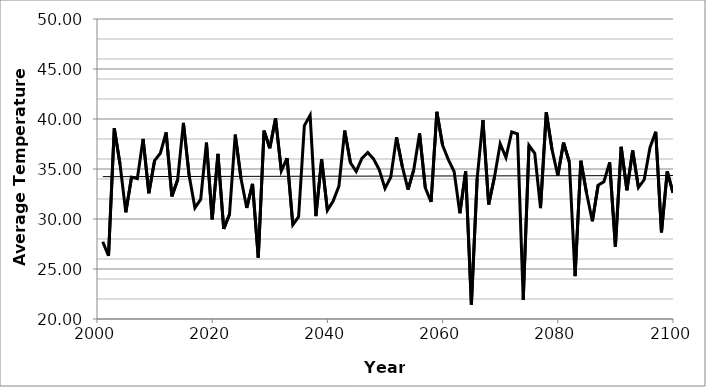
| Category | Committed |
|---|---|
| 2001.0 | 27.72 |
| 2002.0 | 26.314 |
| 2003.0 | 39.076 |
| 2004.0 | 35.478 |
| 2005.0 | 30.664 |
| 2006.0 | 34.189 |
| 2007.0 | 34.034 |
| 2008.0 | 38.005 |
| 2009.0 | 32.574 |
| 2010.0 | 35.845 |
| 2011.0 | 36.579 |
| 2012.0 | 38.653 |
| 2013.0 | 32.261 |
| 2014.0 | 33.915 |
| 2015.0 | 39.609 |
| 2016.0 | 34.345 |
| 2017.0 | 31.12 |
| 2018.0 | 31.96 |
| 2019.0 | 37.647 |
| 2020.0 | 29.964 |
| 2021.0 | 36.523 |
| 2022.0 | 29.012 |
| 2023.0 | 30.457 |
| 2024.0 | 38.437 |
| 2025.0 | 34.048 |
| 2026.0 | 31.107 |
| 2027.0 | 33.512 |
| 2028.0 | 26.134 |
| 2029.0 | 38.836 |
| 2030.0 | 37.076 |
| 2031.0 | 40.062 |
| 2032.0 | 34.806 |
| 2033.0 | 36.084 |
| 2034.0 | 29.417 |
| 2035.0 | 30.231 |
| 2036.0 | 39.337 |
| 2037.0 | 40.366 |
| 2038.0 | 30.281 |
| 2039.0 | 35.964 |
| 2040.0 | 30.873 |
| 2041.0 | 31.789 |
| 2042.0 | 33.294 |
| 2043.0 | 38.845 |
| 2044.0 | 35.631 |
| 2045.0 | 34.758 |
| 2046.0 | 36.081 |
| 2047.0 | 36.651 |
| 2048.0 | 36.021 |
| 2049.0 | 34.929 |
| 2050.0 | 33.062 |
| 2051.0 | 34.185 |
| 2052.0 | 38.167 |
| 2053.0 | 35.26 |
| 2054.0 | 32.938 |
| 2055.0 | 34.945 |
| 2056.0 | 38.55 |
| 2057.0 | 33.114 |
| 2058.0 | 31.698 |
| 2059.0 | 40.714 |
| 2060.0 | 37.368 |
| 2061.0 | 35.933 |
| 2062.0 | 34.747 |
| 2063.0 | 30.569 |
| 2064.0 | 34.759 |
| 2065.0 | 21.438 |
| 2066.0 | 34.059 |
| 2067.0 | 39.893 |
| 2068.0 | 31.453 |
| 2069.0 | 34.18 |
| 2070.0 | 37.526 |
| 2071.0 | 36.145 |
| 2072.0 | 38.701 |
| 2073.0 | 38.514 |
| 2074.0 | 21.931 |
| 2075.0 | 37.359 |
| 2076.0 | 36.57 |
| 2077.0 | 31.087 |
| 2078.0 | 40.667 |
| 2079.0 | 36.934 |
| 2080.0 | 34.36 |
| 2081.0 | 37.638 |
| 2082.0 | 35.69 |
| 2083.0 | 24.292 |
| 2084.0 | 35.827 |
| 2085.0 | 32.578 |
| 2086.0 | 29.781 |
| 2087.0 | 33.372 |
| 2088.0 | 33.73 |
| 2089.0 | 35.661 |
| 2090.0 | 27.239 |
| 2091.0 | 37.22 |
| 2092.0 | 32.875 |
| 2093.0 | 36.851 |
| 2094.0 | 33.148 |
| 2095.0 | 33.931 |
| 2096.0 | 37.132 |
| 2097.0 | 38.723 |
| 2098.0 | 28.663 |
| 2099.0 | 34.765 |
| 2100.0 | 32.619 |